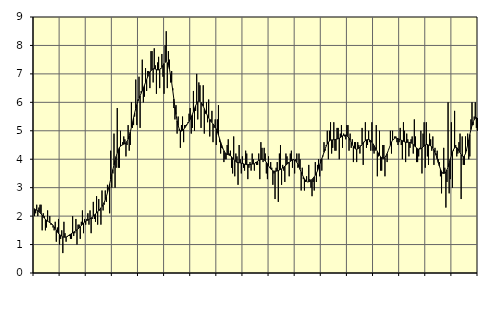
| Category | Piggar | Series 1 |
|---|---|---|
| nan | 2 | 2.26 |
| 87.0 | 2.1 | 2.22 |
| 87.0 | 2.4 | 2.21 |
| 87.0 | 2 | 2.19 |
| 87.0 | 2.3 | 2.16 |
| 87.0 | 2.4 | 2.12 |
| 87.0 | 2.4 | 2.08 |
| 87.0 | 1.5 | 2.03 |
| 87.0 | 2.1 | 1.98 |
| 87.0 | 2 | 1.93 |
| 87.0 | 1.5 | 1.89 |
| 87.0 | 1.6 | 1.85 |
| nan | 2.2 | 1.82 |
| 88.0 | 1.8 | 1.8 |
| 88.0 | 2 | 1.77 |
| 88.0 | 1.7 | 1.75 |
| 88.0 | 1.7 | 1.72 |
| 88.0 | 1.6 | 1.67 |
| 88.0 | 1.5 | 1.62 |
| 88.0 | 1.8 | 1.56 |
| 88.0 | 1.1 | 1.5 |
| 88.0 | 1.6 | 1.44 |
| 88.0 | 1.9 | 1.39 |
| 88.0 | 1 | 1.36 |
| nan | 1.2 | 1.32 |
| 89.0 | 1.5 | 1.3 |
| 89.0 | 0.7 | 1.27 |
| 89.0 | 1.8 | 1.26 |
| 89.0 | 1.4 | 1.26 |
| 89.0 | 1.1 | 1.26 |
| 89.0 | 1.3 | 1.28 |
| 89.0 | 1.3 | 1.31 |
| 89.0 | 1.3 | 1.34 |
| 89.0 | 1.2 | 1.36 |
| 89.0 | 1.2 | 1.39 |
| 89.0 | 2 | 1.41 |
| nan | 1.3 | 1.44 |
| 90.0 | 1.4 | 1.46 |
| 90.0 | 1.9 | 1.49 |
| 90.0 | 1 | 1.52 |
| 90.0 | 1.7 | 1.55 |
| 90.0 | 1.7 | 1.59 |
| 90.0 | 1.2 | 1.63 |
| 90.0 | 1.8 | 1.67 |
| 90.0 | 2.2 | 1.71 |
| 90.0 | 1.4 | 1.76 |
| 90.0 | 1.9 | 1.79 |
| 90.0 | 1.7 | 1.82 |
| nan | 1.9 | 1.84 |
| 91.0 | 2.1 | 1.86 |
| 91.0 | 1.7 | 1.88 |
| 91.0 | 2.2 | 1.9 |
| 91.0 | 1.4 | 1.93 |
| 91.0 | 1.9 | 1.96 |
| 91.0 | 2.5 | 2 |
| 91.0 | 1.9 | 2.04 |
| 91.0 | 1.8 | 2.08 |
| 91.0 | 2.7 | 2.11 |
| 91.0 | 1.7 | 2.15 |
| 91.0 | 2.6 | 2.19 |
| nan | 2.2 | 2.24 |
| 92.0 | 1.7 | 2.29 |
| 92.0 | 2.9 | 2.34 |
| 92.0 | 2.2 | 2.4 |
| 92.0 | 2.4 | 2.48 |
| 92.0 | 2.9 | 2.58 |
| 92.0 | 2.5 | 2.69 |
| 92.0 | 3.1 | 2.82 |
| 92.0 | 3 | 2.97 |
| 92.0 | 2.1 | 3.13 |
| 92.0 | 4.3 | 3.3 |
| 92.0 | 3 | 3.47 |
| nan | 3.5 | 3.64 |
| 93.0 | 4.9 | 3.8 |
| 93.0 | 3 | 3.96 |
| 93.0 | 3.7 | 4.1 |
| 93.0 | 5.8 | 4.23 |
| 93.0 | 3.7 | 4.33 |
| 93.0 | 3.7 | 4.41 |
| 93.0 | 5 | 4.46 |
| 93.0 | 4.5 | 4.49 |
| 93.0 | 4.6 | 4.51 |
| 93.0 | 4.8 | 4.53 |
| 93.0 | 4.7 | 4.54 |
| nan | 4.1 | 4.58 |
| 94.0 | 4.5 | 4.63 |
| 94.0 | 5.2 | 4.71 |
| 94.0 | 4.3 | 4.83 |
| 94.0 | 4.5 | 4.96 |
| 94.0 | 6 | 5.12 |
| 94.0 | 5.1 | 5.29 |
| 94.0 | 5.2 | 5.46 |
| 94.0 | 5.5 | 5.63 |
| 94.0 | 6.8 | 5.78 |
| 94.0 | 5.2 | 5.92 |
| 94.0 | 6.1 | 6.04 |
| nan | 6.9 | 6.14 |
| 95.0 | 5.1 | 6.23 |
| 95.0 | 6.4 | 6.32 |
| 95.0 | 7.5 | 6.41 |
| 95.0 | 6 | 6.5 |
| 95.0 | 6.2 | 6.6 |
| 95.0 | 7.2 | 6.7 |
| 95.0 | 6.4 | 6.8 |
| 95.0 | 7.1 | 6.9 |
| 95.0 | 7.1 | 6.99 |
| 95.0 | 6.5 | 7.06 |
| 95.0 | 7.8 | 7.11 |
| nan | 7.8 | 7.15 |
| 96.0 | 6.7 | 7.18 |
| 96.0 | 7.9 | 7.18 |
| 96.0 | 7.3 | 7.17 |
| 96.0 | 6.3 | 7.15 |
| 96.0 | 7.4 | 7.14 |
| 96.0 | 7.6 | 7.14 |
| 96.0 | 6.5 | 7.15 |
| 96.0 | 7.2 | 7.18 |
| 96.0 | 7.7 | 7.23 |
| 96.0 | 6.9 | 7.3 |
| 96.0 | 6.3 | 7.36 |
| nan | 8 | 7.41 |
| 97.0 | 8.5 | 7.43 |
| 97.0 | 6.5 | 7.39 |
| 97.0 | 7.8 | 7.3 |
| 97.0 | 7.5 | 7.16 |
| 97.0 | 6.7 | 6.95 |
| 97.0 | 7.1 | 6.7 |
| 97.0 | 6.5 | 6.42 |
| 97.0 | 5.8 | 6.12 |
| 97.0 | 5.4 | 5.83 |
| 97.0 | 5.9 | 5.57 |
| 97.0 | 4.9 | 5.35 |
| nan | 5.5 | 5.18 |
| 98.0 | 5 | 5.06 |
| 98.0 | 4.4 | 5 |
| 98.0 | 5.2 | 4.99 |
| 98.0 | 5.5 | 5.01 |
| 98.0 | 4.6 | 5.05 |
| 98.0 | 5.2 | 5.1 |
| 98.0 | 5.2 | 5.16 |
| 98.0 | 5.2 | 5.22 |
| 98.0 | 5.3 | 5.27 |
| 98.0 | 5.6 | 5.33 |
| 98.0 | 5.8 | 5.4 |
| nan | 4.9 | 5.48 |
| 99.0 | 5.1 | 5.57 |
| 99.0 | 6.4 | 5.68 |
| 99.0 | 5 | 5.78 |
| 99.0 | 5.7 | 5.88 |
| 99.0 | 7 | 5.96 |
| 99.0 | 5.4 | 6.02 |
| 99.0 | 6.7 | 6.04 |
| 99.0 | 6.6 | 6.04 |
| 99.0 | 5.1 | 6 |
| 99.0 | 5.9 | 5.94 |
| 99.0 | 6.6 | 5.86 |
| nan | 4.9 | 5.78 |
| 0.0 | 5.6 | 5.69 |
| 0.0 | 6 | 5.61 |
| 0.0 | 5.3 | 5.52 |
| 0.0 | 6.1 | 5.45 |
| 0.0 | 4.8 | 5.39 |
| 0.0 | 5.4 | 5.33 |
| 0.0 | 5.7 | 5.29 |
| 0.0 | 4.6 | 5.24 |
| 0.0 | 5.1 | 5.19 |
| 0.0 | 5.4 | 5.14 |
| 0.0 | 4.5 | 5.06 |
| nan | 5.4 | 4.96 |
| 1.0 | 5.9 | 4.85 |
| 1.0 | 4.6 | 4.73 |
| 1.0 | 4.2 | 4.6 |
| 1.0 | 4.4 | 4.49 |
| 1.0 | 4.4 | 4.38 |
| 1.0 | 3.9 | 4.3 |
| 1.0 | 4 | 4.23 |
| 1.0 | 4 | 4.19 |
| 1.0 | 4.5 | 4.17 |
| 1.0 | 4.7 | 4.16 |
| 1.0 | 4.2 | 4.14 |
| nan | 4.3 | 4.12 |
| 2.0 | 3.7 | 4.09 |
| 2.0 | 3.5 | 4.04 |
| 2.0 | 4.8 | 4 |
| 2.0 | 3.4 | 3.96 |
| 2.0 | 4.2 | 3.92 |
| 2.0 | 4.1 | 3.89 |
| 2.0 | 3.1 | 3.88 |
| 2.0 | 4.5 | 3.88 |
| 2.0 | 4 | 3.87 |
| 2.0 | 3.5 | 3.86 |
| 2.0 | 4.1 | 3.85 |
| nan | 3.7 | 3.84 |
| 3.0 | 3.6 | 3.82 |
| 3.0 | 4.3 | 3.82 |
| 3.0 | 4.2 | 3.81 |
| 3.0 | 3.3 | 3.81 |
| 3.0 | 3.7 | 3.81 |
| 3.0 | 3.9 | 3.81 |
| 3.0 | 3.6 | 3.82 |
| 3.0 | 4.2 | 3.83 |
| 3.0 | 4 | 3.83 |
| 3.0 | 3.6 | 3.84 |
| 3.0 | 3.9 | 3.87 |
| nan | 3.8 | 3.9 |
| 4.0 | 3.8 | 3.93 |
| 4.0 | 4.2 | 3.96 |
| 4.0 | 3.3 | 3.98 |
| 4.0 | 4.6 | 3.99 |
| 4.0 | 4.4 | 4 |
| 4.0 | 3.9 | 4 |
| 4.0 | 4.4 | 3.98 |
| 4.0 | 4.2 | 3.94 |
| 4.0 | 3.5 | 3.89 |
| 4.0 | 3.3 | 3.84 |
| 4.0 | 4.1 | 3.77 |
| nan | 3.7 | 3.71 |
| 5.0 | 3.9 | 3.66 |
| 5.0 | 3.7 | 3.62 |
| 5.0 | 3.1 | 3.59 |
| 5.0 | 3.5 | 3.58 |
| 5.0 | 2.6 | 3.58 |
| 5.0 | 3.7 | 3.58 |
| 5.0 | 3.9 | 3.59 |
| 5.0 | 2.5 | 3.6 |
| 5.0 | 4.2 | 3.62 |
| 5.0 | 4.5 | 3.64 |
| 5.0 | 3.1 | 3.66 |
| nan | 3.8 | 3.69 |
| 6.0 | 3.6 | 3.72 |
| 6.0 | 3.2 | 3.76 |
| 6.0 | 4.2 | 3.79 |
| 6.0 | 4.1 | 3.83 |
| 6.0 | 3.9 | 3.86 |
| 6.0 | 3.4 | 3.89 |
| 6.0 | 4.2 | 3.92 |
| 6.0 | 4.3 | 3.95 |
| 6.0 | 3.7 | 3.98 |
| 6.0 | 4 | 3.98 |
| 6.0 | 3.5 | 3.97 |
| nan | 4 | 3.94 |
| 7.0 | 4.2 | 3.89 |
| 7.0 | 3.7 | 3.82 |
| 7.0 | 4.2 | 3.73 |
| 7.0 | 4 | 3.64 |
| 7.0 | 2.9 | 3.54 |
| 7.0 | 3.7 | 3.46 |
| 7.0 | 3.3 | 3.38 |
| 7.0 | 2.9 | 3.31 |
| 7.0 | 3.2 | 3.26 |
| 7.0 | 3.4 | 3.22 |
| 7.0 | 3.2 | 3.2 |
| nan | 3.8 | 3.21 |
| 8.0 | 3.3 | 3.22 |
| 8.0 | 3 | 3.25 |
| 8.0 | 2.7 | 3.29 |
| 8.0 | 3.2 | 3.33 |
| 8.0 | 2.9 | 3.38 |
| 8.0 | 3.9 | 3.44 |
| 8.0 | 3.2 | 3.51 |
| 8.0 | 3.8 | 3.59 |
| 8.0 | 4 | 3.69 |
| 8.0 | 3.4 | 3.8 |
| 8.0 | 4 | 3.91 |
| nan | 3.6 | 4.02 |
| 9.0 | 4.1 | 4.13 |
| 9.0 | 4.6 | 4.24 |
| 9.0 | 4.3 | 4.36 |
| 9.0 | 4.5 | 4.46 |
| 9.0 | 5 | 4.54 |
| 9.0 | 4 | 4.6 |
| 9.0 | 5 | 4.64 |
| 9.0 | 5.3 | 4.67 |
| 9.0 | 4.2 | 4.68 |
| 9.0 | 4.4 | 4.68 |
| 9.0 | 5.3 | 4.69 |
| nan | 4.3 | 4.69 |
| 10.0 | 4.3 | 4.7 |
| 10.0 | 5.1 | 4.71 |
| 10.0 | 5.1 | 4.72 |
| 10.0 | 4 | 4.74 |
| 10.0 | 4.9 | 4.76 |
| 10.0 | 5.2 | 4.79 |
| 10.0 | 4.4 | 4.82 |
| 10.0 | 4.9 | 4.84 |
| 10.0 | 4.8 | 4.85 |
| 10.0 | 4.7 | 4.85 |
| 10.0 | 5.2 | 4.83 |
| nan | 5.2 | 4.79 |
| 11.0 | 4.3 | 4.74 |
| 11.0 | 4.9 | 4.67 |
| 11.0 | 4.4 | 4.59 |
| 11.0 | 4.7 | 4.51 |
| 11.0 | 3.9 | 4.45 |
| 11.0 | 4.6 | 4.39 |
| 11.0 | 4.6 | 4.36 |
| 11.0 | 3.9 | 4.35 |
| 11.0 | 4.6 | 4.36 |
| 11.0 | 4.5 | 4.39 |
| 11.0 | 4.2 | 4.43 |
| nan | 4.5 | 4.47 |
| 12.0 | 5.1 | 4.52 |
| 12.0 | 3.8 | 4.57 |
| 12.0 | 4.6 | 4.62 |
| 12.0 | 5.3 | 4.65 |
| 12.0 | 4.4 | 4.68 |
| 12.0 | 4.5 | 4.69 |
| 12.0 | 5 | 4.69 |
| 12.0 | 4.6 | 4.68 |
| 12.0 | 4.3 | 4.65 |
| 12.0 | 5.3 | 4.6 |
| 12.0 | 4.3 | 4.54 |
| nan | 4.2 | 4.48 |
| 13.0 | 4.3 | 4.41 |
| 13.0 | 5.2 | 4.34 |
| 13.0 | 3.4 | 4.28 |
| 13.0 | 4.1 | 4.21 |
| 13.0 | 5 | 4.14 |
| 13.0 | 3.6 | 4.09 |
| 13.0 | 3.6 | 4.05 |
| 13.0 | 4.5 | 4.03 |
| 13.0 | 4.5 | 4.03 |
| 13.0 | 3.4 | 4.06 |
| 13.0 | 4.1 | 4.12 |
| nan | 3.9 | 4.2 |
| 14.0 | 4.3 | 4.3 |
| 14.0 | 4.4 | 4.4 |
| 14.0 | 5 | 4.5 |
| 14.0 | 4.2 | 4.6 |
| 14.0 | 5 | 4.67 |
| 14.0 | 4.7 | 4.71 |
| 14.0 | 4.8 | 4.74 |
| 14.0 | 4.8 | 4.75 |
| 14.0 | 4.6 | 4.74 |
| 14.0 | 4.5 | 4.72 |
| 14.0 | 4.6 | 4.71 |
| nan | 5.1 | 4.69 |
| 15.0 | 4.5 | 4.67 |
| 15.0 | 4 | 4.65 |
| 15.0 | 5.3 | 4.63 |
| 15.0 | 5 | 4.61 |
| 15.0 | 3.9 | 4.6 |
| 15.0 | 4.9 | 4.59 |
| 15.0 | 4.7 | 4.6 |
| 15.0 | 4.1 | 4.59 |
| 15.0 | 4.4 | 4.59 |
| 15.0 | 4.7 | 4.58 |
| 15.0 | 4.8 | 4.55 |
| nan | 4.2 | 4.52 |
| 16.0 | 5.4 | 4.48 |
| 16.0 | 4.8 | 4.43 |
| 16.0 | 3.9 | 4.4 |
| 16.0 | 3.9 | 4.37 |
| 16.0 | 4.1 | 4.35 |
| 16.0 | 4.4 | 4.36 |
| 16.0 | 5 | 4.37 |
| 16.0 | 3.5 | 4.39 |
| 16.0 | 4.9 | 4.43 |
| 16.0 | 5.3 | 4.47 |
| 16.0 | 3.7 | 4.5 |
| nan | 5.3 | 4.52 |
| 17.0 | 4.1 | 4.52 |
| 17.0 | 3.8 | 4.5 |
| 17.0 | 4.9 | 4.49 |
| 17.0 | 4.7 | 4.47 |
| 17.0 | 4.3 | 4.44 |
| 17.0 | 4.8 | 4.39 |
| 17.0 | 3.8 | 4.32 |
| 17.0 | 4.4 | 4.24 |
| 17.0 | 4.2 | 4.14 |
| 17.0 | 4.3 | 4.01 |
| 17.0 | 4 | 3.88 |
| nan | 3.9 | 3.76 |
| 18.0 | 3.4 | 3.65 |
| 18.0 | 2.8 | 3.57 |
| 18.0 | 3.5 | 3.52 |
| 18.0 | 4.4 | 3.5 |
| 18.0 | 3.7 | 3.51 |
| 18.0 | 2.3 | 3.55 |
| 18.0 | 3.2 | 3.63 |
| 18.0 | 6 | 3.73 |
| 18.0 | 2.8 | 3.86 |
| 18.0 | 3.3 | 4 |
| 18.0 | 5.3 | 4.13 |
| nan | 3 | 4.25 |
| 19.0 | 4.3 | 4.34 |
| 19.0 | 5.7 | 4.4 |
| 19.0 | 4.5 | 4.42 |
| 19.0 | 4.1 | 4.41 |
| 19.0 | 4.2 | 4.36 |
| 19.0 | 4.6 | 4.3 |
| 19.0 | 4.9 | 4.23 |
| 19.0 | 2.6 | 4.16 |
| 19.0 | 4.8 | 4.11 |
| 19.0 | 3.8 | 4.09 |
| 19.0 | 3.8 | 4.12 |
| nan | 4.8 | 4.2 |
| 20.0 | 4.3 | 4.34 |
| 20.0 | 4.9 | 4.5 |
| 20.0 | 4 | 4.68 |
| 20.0 | 4.1 | 4.87 |
| 20.0 | 5.4 | 5.04 |
| 20.0 | 6 | 5.19 |
| 20.0 | 5.2 | 5.31 |
| 20.0 | 5.5 | 5.39 |
| 20.0 | 6 | 5.44 |
| 20.0 | 5.1 | 5.46 |
| 20.0 | 5 | 5.45 |